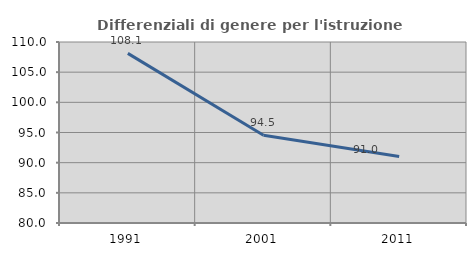
| Category | Differenziali di genere per l'istruzione superiore |
|---|---|
| 1991.0 | 108.119 |
| 2001.0 | 94.537 |
| 2011.0 | 91.03 |